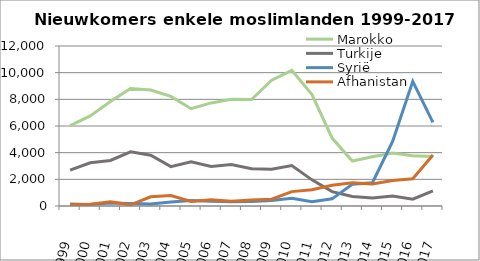
| Category | Marokko | Turkije | Syrië | Afhanistan |
|---|---|---|---|---|
| 1999.0 | 6035 | 2687 | 141 | 119 |
| 2000.0 | 6752 | 3245 | 108 | 129 |
| 2001.0 | 7835 | 3418 | 225 | 312 |
| 2002.0 | 8816 | 4061 | 189 | 91 |
| 2003.0 | 8695 | 3802 | 153 | 686 |
| 2004.0 | 8220 | 2954 | 303 | 786 |
| 2005.0 | 7299 | 3324 | 415 | 338 |
| 2006.0 | 7731 | 2961 | 358 | 462 |
| 2007.0 | 8003 | 3111 | 312 | 350 |
| 2008.0 | 7986 | 2792 | 333 | 447 |
| 2009.0 | 9436 | 2750 | 414 | 509 |
| 2010.0 | 10172 | 3037 | 588 | 1079 |
| 2011.0 | 8354 | 1961 | 321 | 1214 |
| 2012.0 | 5095 | 1076 | 537 | 1560 |
| 2013.0 | 3376 | 709 | 1634 | 1749 |
| 2014.0 | 3697 | 597 | 1742 | 1659 |
| 2015.0 | 3978 | 746 | 4843 | 1919 |
| 2016.0 | 3765 | 506 | 9349 | 2044 |
| 2017.0 | 3713 | 1127 | 6274 | 3824 |